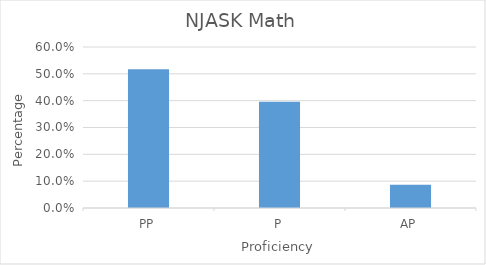
| Category | Series 0 |
|---|---|
| PP | 0.517 |
| P | 0.396 |
| AP | 0.087 |